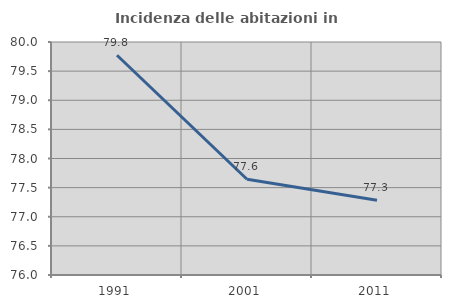
| Category | Incidenza delle abitazioni in proprietà  |
|---|---|
| 1991.0 | 79.773 |
| 2001.0 | 77.644 |
| 2011.0 | 77.283 |